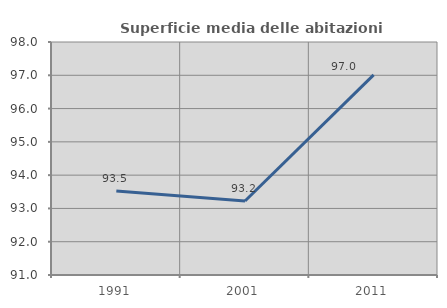
| Category | Superficie media delle abitazioni occupate |
|---|---|
| 1991.0 | 93.527 |
| 2001.0 | 93.223 |
| 2011.0 | 97.011 |